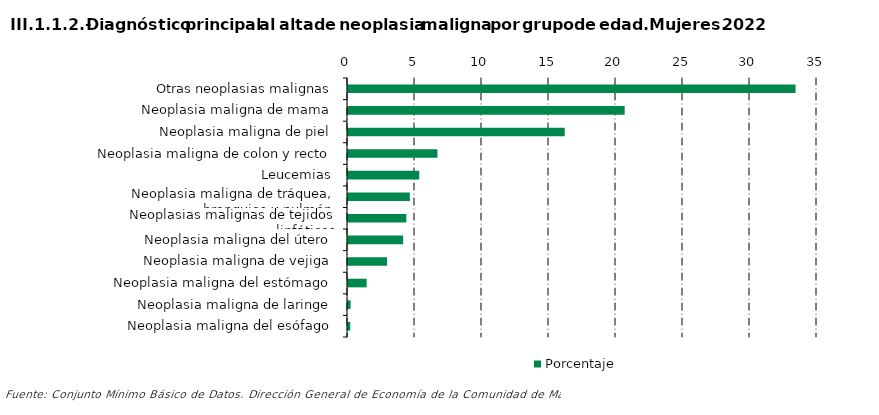
| Category | Porcentaje |
|---|---|
| Otras neoplasias malignas | 33.4 |
| Neoplasia maligna de mama | 20.649 |
| Neoplasia maligna de piel | 16.171 |
| Neoplasia maligna de colon y recto | 6.673 |
| Leucemias | 5.316 |
| Neoplasia maligna de tráquea, bronquios y pulmón | 4.615 |
| Neoplasias malignas de tejidos linfáticos | 4.352 |
| Neoplasia maligna del útero | 4.116 |
| Neoplasia maligna de vejiga | 2.912 |
| Neoplasia maligna del estómago | 1.391 |
| Neoplasia maligna de laringe | 0.193 |
| Neoplasia maligna del esófago | 0.169 |